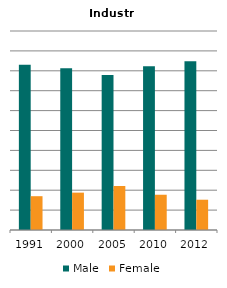
| Category | Male | Female |
|---|---|---|
| 1991.0 | 0.83 | 0.17 |
| 2000.0 | 0.812 | 0.188 |
| 2005.0 | 0.779 | 0.221 |
| 2010.0 | 0.823 | 0.177 |
| 2012.0 | 0.848 | 0.152 |